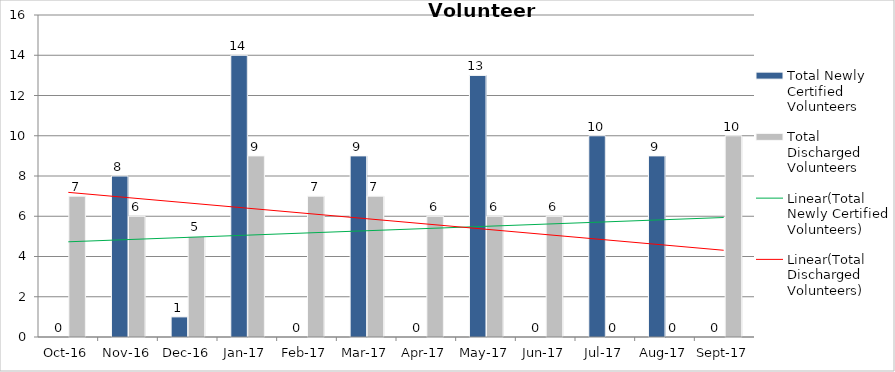
| Category | Total Newly Certified Volunteers | Total Discharged Volunteers |
|---|---|---|
| 2016-10-01 | 0 | 7 |
| 2016-11-01 | 8 | 6 |
| 2016-12-01 | 1 | 5 |
| 2017-01-01 | 14 | 9 |
| 2017-02-01 | 0 | 7 |
| 2017-03-01 | 9 | 7 |
| 2017-04-01 | 0 | 6 |
| 2017-05-01 | 13 | 6 |
| 2017-06-01 | 0 | 6 |
| 2017-07-01 | 10 | 0 |
| 2017-08-01 | 9 | 0 |
| 2017-09-01 | 0 | 10 |